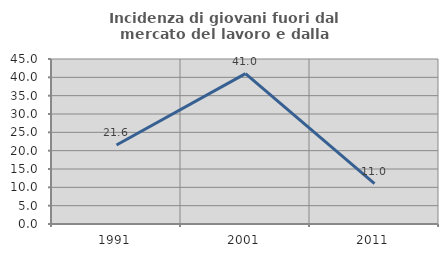
| Category | Incidenza di giovani fuori dal mercato del lavoro e dalla formazione  |
|---|---|
| 1991.0 | 21.552 |
| 2001.0 | 41.011 |
| 2011.0 | 10.983 |